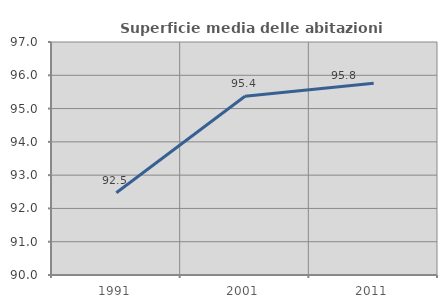
| Category | Superficie media delle abitazioni occupate |
|---|---|
| 1991.0 | 92.471 |
| 2001.0 | 95.37 |
| 2011.0 | 95.764 |